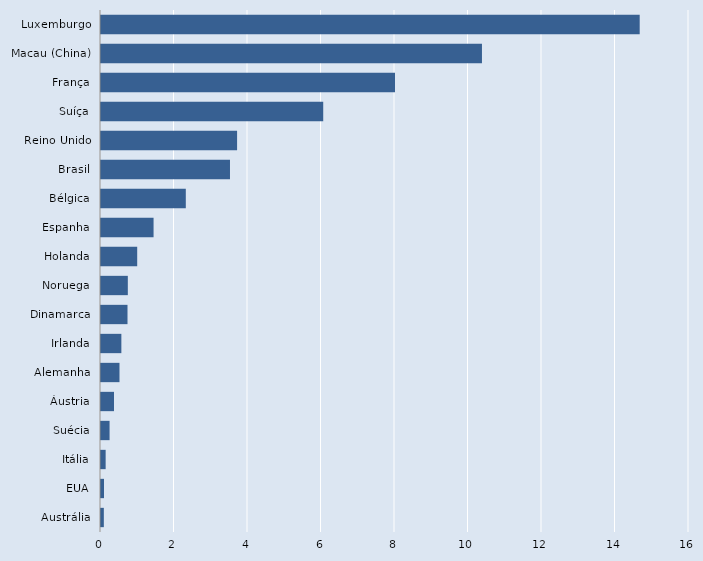
| Category | Series 0 |
|---|---|
| Austrália | 0.077 |
| EUA | 0.082 |
| Itália | 0.126 |
| Suécia | 0.233 |
| Áustria | 0.353 |
| Alemanha | 0.503 |
| Irlanda | 0.554 |
| Dinamarca | 0.721 |
| Noruega | 0.73 |
| Holanda | 0.985 |
| Espanha | 1.43 |
| Bélgica | 2.308 |
| Brasil | 3.51 |
| Reino Unido | 3.703 |
| Suíça | 6.047 |
| França | 8 |
| Macau (China) | 10.366 |
| Luxemburgo | 14.658 |